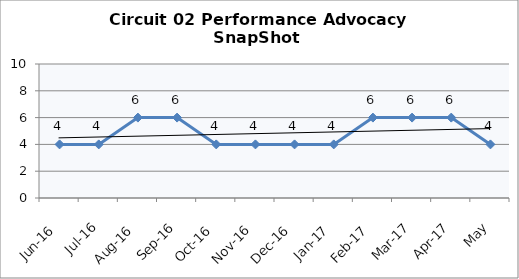
| Category | Circuit 02 |
|---|---|
| Jun-16 | 4 |
| Jul-16 | 4 |
| Aug-16 | 6 |
| Sep-16 | 6 |
| Oct-16 | 4 |
| Nov-16 | 4 |
| Dec-16 | 4 |
| Jan-17 | 4 |
| Feb-17 | 6 |
| Mar-17 | 6 |
| Apr-17 | 6 |
| May | 4 |